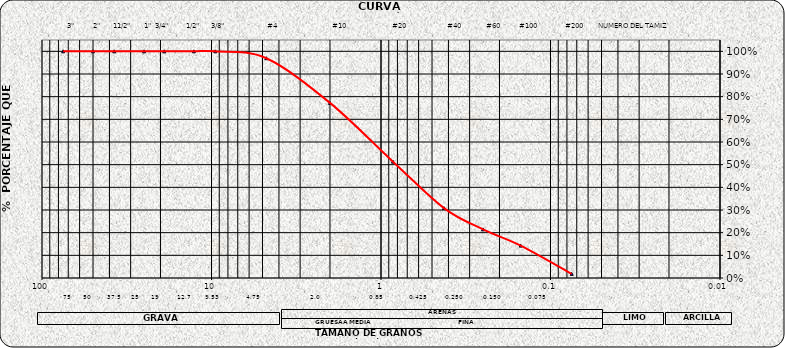
| Category | Series 0 |
|---|---|
| 75.0 | 1 |
| 50.0 | 1 |
| 37.5 | 1 |
| 25.0 | 1 |
| 19.0 | 1 |
| 12.7 | 1 |
| 9.5 | 1 |
| 4.75 | 0.97 |
| 2.0 | 0.773 |
| 0.85 | 0.513 |
| 0.425 | 0.308 |
| 0.25 | 0.214 |
| 0.15 | 0.143 |
| 0.075 | 0.018 |
| nan | 0 |